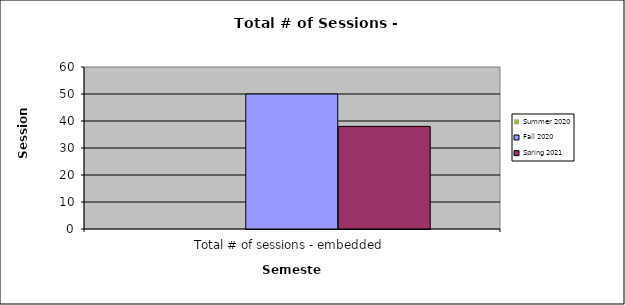
| Category | Summer 2020 | Fall 2020 | Spring 2021 |
|---|---|---|---|
| 0 | 0 | 50 | 38 |